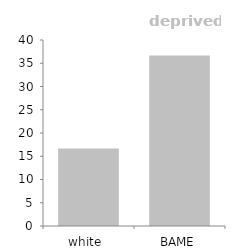
| Category | Series 0 |
|---|---|
| white  | 16.684 |
| BAME | 36.67 |